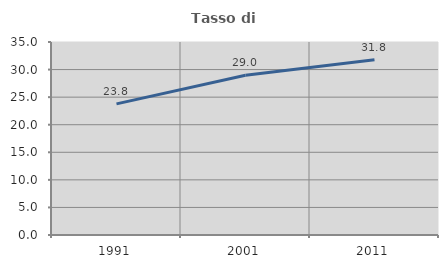
| Category | Tasso di occupazione   |
|---|---|
| 1991.0 | 23.781 |
| 2001.0 | 28.984 |
| 2011.0 | 31.795 |